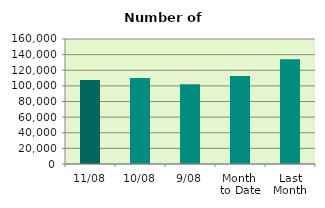
| Category | Series 0 |
|---|---|
| 11/08 | 107654 |
| 10/08 | 110036 |
| 9/08 | 101932 |
| Month 
to Date | 112705.778 |
| Last
Month | 134197.333 |